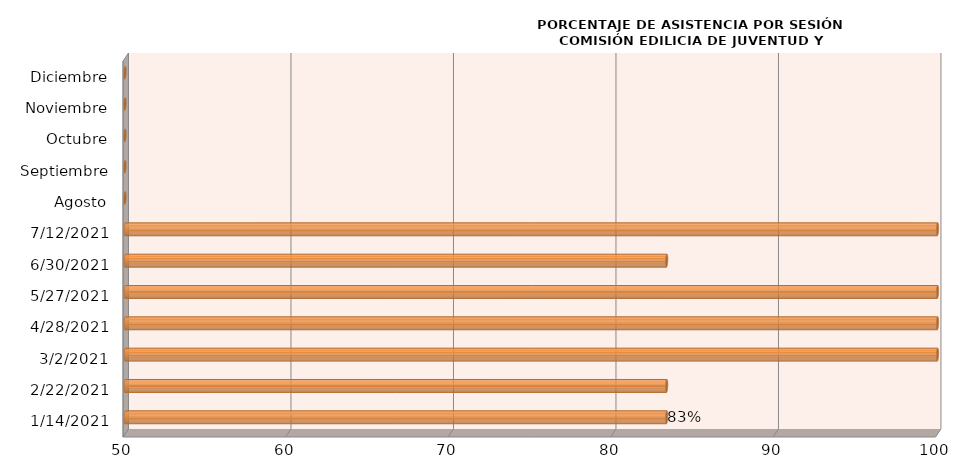
| Category | Series 0 |
|---|---|
| 14/01/2021 | 83.333 |
| 22/02/2021 | 83.333 |
| 02/03/2021 | 100 |
| 28/04/2021 | 100 |
| 27/05/2021 | 100 |
| 30/06/2021 | 83.333 |
| 12/07/2021 | 100 |
| Agosto | 0 |
| Septiembre | 0 |
| Octubre | 0 |
| Noviembre | 0 |
| Diciembre | 0 |